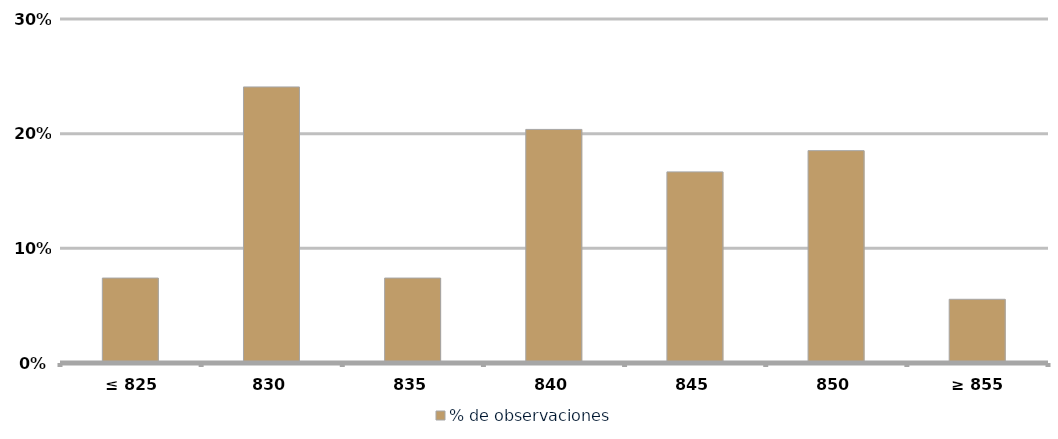
| Category | % de observaciones  |
|---|---|
|  ≤ 825  | 0.074 |
|  830  | 0.241 |
|  835  | 0.074 |
|  840  | 0.204 |
|  845  | 0.167 |
| 850 | 0.185 |
|  ≥ 855  | 0.056 |